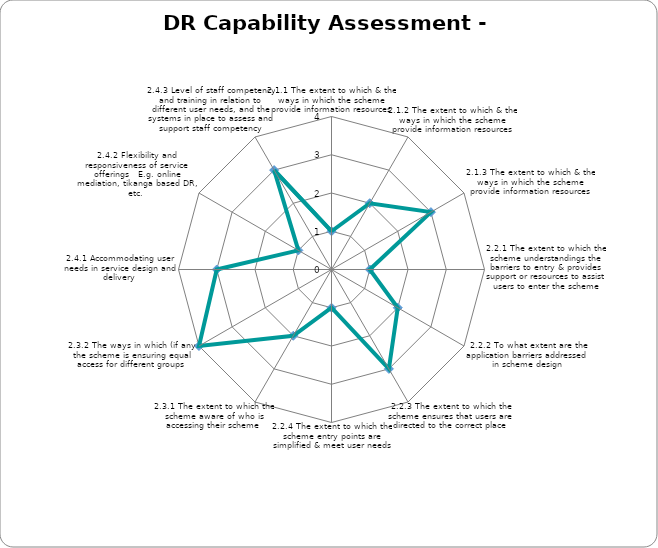
| Category | Series 0 |
|---|---|
| 2.1.1 The extent to which & the ways in which the scheme provide information resources | 1 |
| 2.1.2 The extent to which & the ways in which the scheme provide information resources | 2 |
| 2.1.3 The extent to which & the ways in which the scheme provide information resources | 3 |
| 2.2.1 The extent to which the scheme understandings the barriers to entry & provides support or resources to assist users to enter the scheme | 1 |
| 2.2.2 To what extent are the application barriers addressed in scheme design | 2 |
| 2.2.3 The extent to which the scheme ensures that users are directed to the correct place | 3 |
| 2.2.4 The extent to which the scheme entry points are simplified & meet user needs | 1 |
| 2.3.1 The extent to which the scheme aware of who is accessing their scheme | 2 |
| 2.3.2 The ways in which (if any) the scheme is ensuring equal access for different groups  | 4 |
| 2.4.1 Accommodating user needs in service design and delivery  | 3 |
| 2.4.2 Flexibility and responsiveness of service offerings   E.g. online mediation, tikanga based DR, etc.  | 1 |
| 2.4.3 Level of staff competency and training in relation to different user needs, and the systems in place to assess and support staff competency | 3 |